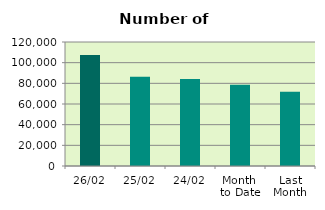
| Category | Series 0 |
|---|---|
| 26/02 | 107316 |
| 25/02 | 86444 |
| 24/02 | 84268 |
| Month 
to Date | 78748.7 |
| Last
Month | 71883.3 |